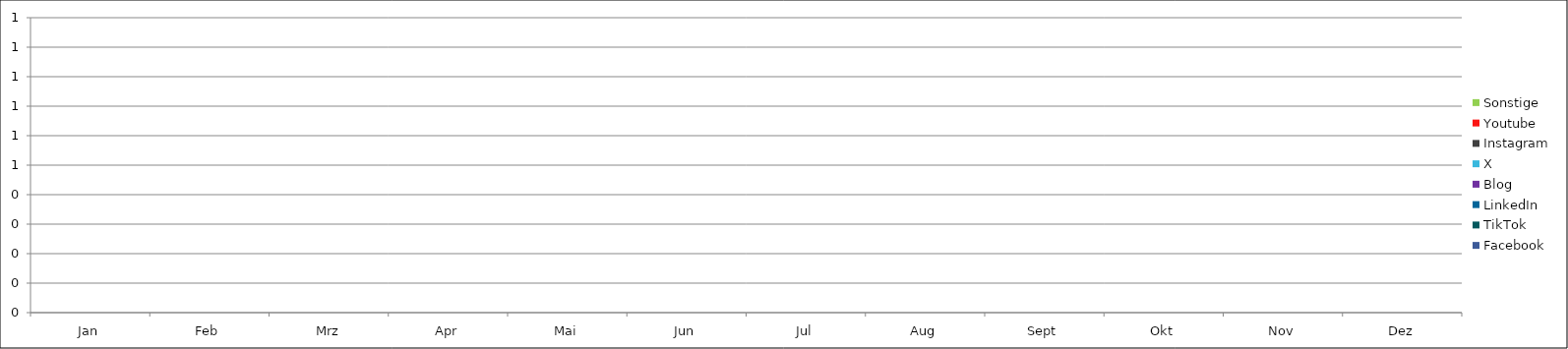
| Category | Facebook | TikTok | LinkedIn | Blog | X | Instagram | Youtube | Sonstige |
|---|---|---|---|---|---|---|---|---|
| Jan | 0 | 0 | 0 | 0 | 0 | 0 | 0 | 0 |
| Feb | 0 | 0 | 0 | 0 | 0 | 0 | 0 | 0 |
| Mrz | 0 | 0 | 0 | 0 | 0 | 0 | 0 | 0 |
| Apr | 0 | 0 | 0 | 0 | 0 | 0 | 0 | 0 |
| Mai | 0 | 0 | 0 | 0 | 0 | 0 | 0 | 0 |
| Jun | 0 | 0 | 0 | 0 | 0 | 0 | 0 | 0 |
| Jul | 0 | 0 | 0 | 0 | 0 | 0 | 0 | 0 |
| Aug | 0 | 0 | 0 | 0 | 0 | 0 | 0 | 0 |
| Sept | 0 | 0 | 0 | 0 | 0 | 0 | 0 | 0 |
| Okt | 0 | 0 | 0 | 0 | 0 | 0 | 0 | 0 |
| Nov | 0 | 0 | 0 | 0 | 0 | 0 | 0 | 0 |
| Dez | 0 | 0 | 0 | 0 | 0 | 0 | 0 | 0 |